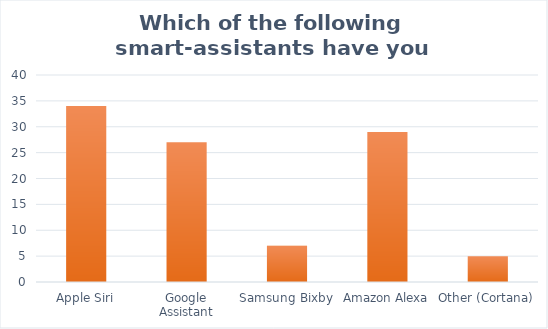
| Category | Series 0 |
|---|---|
| Apple Siri | 34 |
| Google Assistant | 27 |
| Samsung Bixby  | 7 |
| Amazon Alexa | 29 |
| Other (Cortana) | 5 |